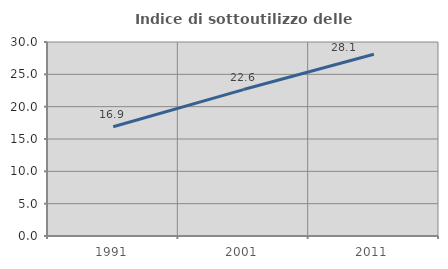
| Category | Indice di sottoutilizzo delle abitazioni  |
|---|---|
| 1991.0 | 16.885 |
| 2001.0 | 22.644 |
| 2011.0 | 28.095 |